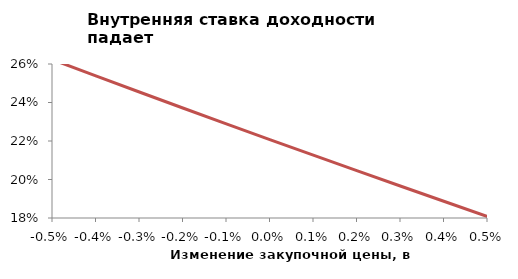
| Category | Series 1 |
|---|---|
| -0.005 | 0.262 |
| -0.004 | 0.254 |
| -0.003 | 0.245 |
| -0.002 | 0.237 |
| -0.001 | 0.229 |
| 0.0 | 0.221 |
| 0.001 | 0.213 |
| 0.002 | 0.204 |
| 0.003 | 0.196 |
| 0.004 | 0.189 |
| 0.005 | 0.181 |